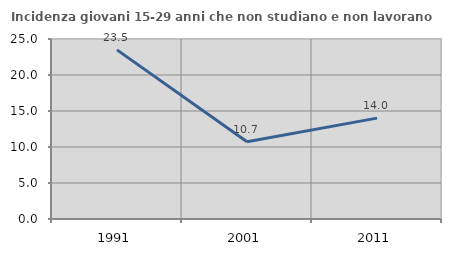
| Category | Incidenza giovani 15-29 anni che non studiano e non lavorano  |
|---|---|
| 1991.0 | 23.492 |
| 2001.0 | 10.727 |
| 2011.0 | 14.009 |